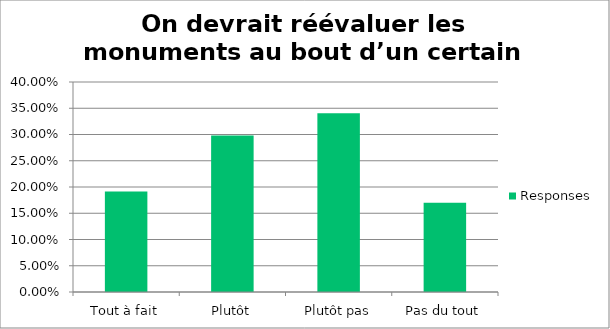
| Category | Responses |
|---|---|
| Tout à fait | 0.192 |
| Plutôt | 0.298 |
| Plutôt pas | 0.34 |
| Pas du tout | 0.17 |